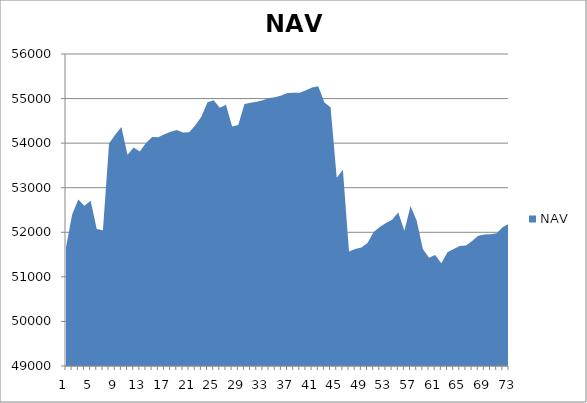
| Category | NAV |
|---|---|
| 0 | 51667 |
| 1 | 52397 |
| 2 | 52733.957 |
| 3 | 52597.875 |
| 4 | 52708.772 |
| 5 | 52075.184 |
| 6 | 52046.775 |
| 7 | 53991.219 |
| 8 | 54189.909 |
| 9 | 54364.909 |
| 10 | 53739.909 |
| 11 | 53899.542 |
| 12 | 53812.294 |
| 13 | 54003.961 |
| 14 | 54140.037 |
| 15 | 54132.37 |
| 16 | 54197.37 |
| 17 | 54255.812 |
| 18 | 54292.622 |
| 19 | 54240.699 |
| 20 | 54246.834 |
| 21 | 54397.391 |
| 22 | 54592.197 |
| 23 | 54920.119 |
| 24 | 54963.245 |
| 25 | 54796.799 |
| 26 | 54863.963 |
| 27 | 54375.975 |
| 28 | 54409.015 |
| 29 | 54878.402 |
| 30 | 54905.151 |
| 31 | 54927.958 |
| 32 | 54964.157 |
| 33 | 55012.385 |
| 34 | 55031.616 |
| 35 | 55070.791 |
| 36 | 55126.461 |
| 37 | 55131.71 |
| 38 | 55133.391 |
| 39 | 55184.783 |
| 40 | 55249.119 |
| 41 | 55278.196 |
| 42 | 54909.993 |
| 43 | 54807.052 |
| 44 | 53224.092 |
| 45 | 53401.214 |
| 46 | 51567.133 |
| 47 | 51627.536 |
| 48 | 51656.382 |
| 49 | 51762.295 |
| 50 | 52007.329 |
| 51 | 52120.149 |
| 52 | 52206.26 |
| 53 | 52279.944 |
| 54 | 52443.406 |
| 55 | 52034.315 |
| 56 | 52592.093 |
| 57 | 52259.795 |
| 58 | 51622.988 |
| 59 | 51427.586 |
| 60 | 51492.401 |
| 61 | 51307.336 |
| 62 | 51550.9 |
| 63 | 51625.058 |
| 64 | 51693.986 |
| 65 | 51704.014 |
| 66 | 51802.294 |
| 67 | 51922.294 |
| 68 | 51950.294 |
| 69 | 51956.603 |
| 70 | 51977.321 |
| 71 | 52120.799 |
| 72 | 52194.825 |